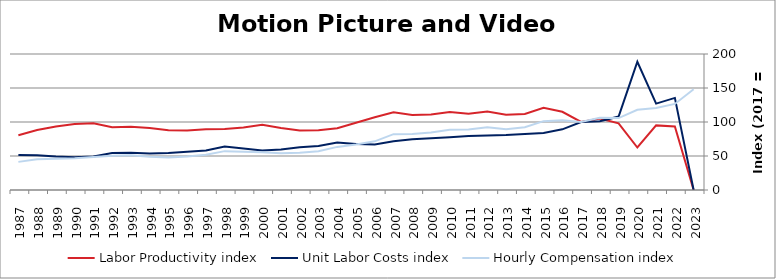
| Category | Labor Productivity index | Unit Labor Costs index | Hourly Compensation index |
|---|---|---|---|
| 2023.0 | 0 | 0 | 148.26 |
| 2022.0 | 93.442 | 135.438 | 126.556 |
| 2021.0 | 95.002 | 127.051 | 120.7 |
| 2020.0 | 62.5 | 188.617 | 117.885 |
| 2019.0 | 97.977 | 107.987 | 105.803 |
| 2018.0 | 105.201 | 100.973 | 106.225 |
| 2017.0 | 100 | 100 | 100 |
| 2016.0 | 115.049 | 89.25 | 102.681 |
| 2015.0 | 120.863 | 83.765 | 101.24 |
| 2014.0 | 111.798 | 82.524 | 92.261 |
| 2013.0 | 110.582 | 80.853 | 89.409 |
| 2012.0 | 115.477 | 80.01 | 92.393 |
| 2011.0 | 111.985 | 79.394 | 88.909 |
| 2010.0 | 114.617 | 77.439 | 88.759 |
| 2009.0 | 111.181 | 76.003 | 84.501 |
| 2008.0 | 110.263 | 74.538 | 82.188 |
| 2007.0 | 114.383 | 71.804 | 82.132 |
| 2006.0 | 106.879 | 66.963 | 71.569 |
| 2005.0 | 98.798 | 67.657 | 66.844 |
| 2004.0 | 90.817 | 69.801 | 63.392 |
| 2003.0 | 87.855 | 64.824 | 56.951 |
| 2002.0 | 87.411 | 62.709 | 54.814 |
| 2001.0 | 91.064 | 59.427 | 54.117 |
| 2000.0 | 95.818 | 57.944 | 55.521 |
| 1999.0 | 91.938 | 61.07 | 56.147 |
| 1998.0 | 89.602 | 63.793 | 57.16 |
| 1997.0 | 89.216 | 58.184 | 51.909 |
| 1996.0 | 87.38 | 56.237 | 49.14 |
| 1995.0 | 87.849 | 54.535 | 47.909 |
| 1994.0 | 91.119 | 53.708 | 48.938 |
| 1993.0 | 93.169 | 54.932 | 51.18 |
| 1992.0 | 92.433 | 54.345 | 50.232 |
| 1991.0 | 98.294 | 49.428 | 48.585 |
| 1990.0 | 97.149 | 48.007 | 46.639 |
| 1989.0 | 93.312 | 49.1 | 45.816 |
| 1988.0 | 88.144 | 51.098 | 45.04 |
| 1987.0 | 80.592 | 51.308 | 41.351 |